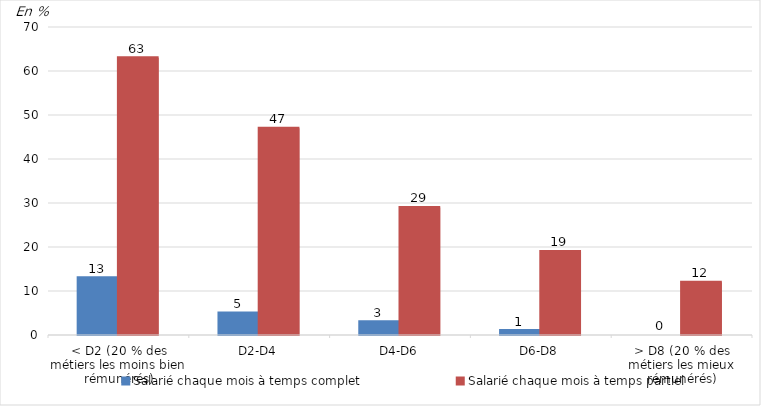
| Category | Salarié chaque mois à temps complet | Salarié chaque mois à temps partiel |
|---|---|---|
| < D2 (20 % des métiers les moins bien rémunérés) | 13 | 63 |
| D2-D4 | 5 | 47 |
| D4-D6 | 3 | 29 |
| D6-D8 | 1 | 19 |
| > D8 (20 % des métiers les mieux rémunérés) | 0 | 12 |